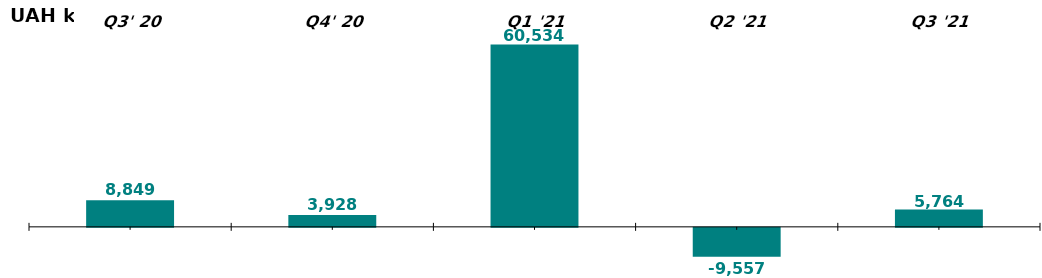
| Category | Quartely Net Flow of Capital in Q3 2020-21, UAH k |
|---|---|
| Q3' 20 | 8849.263 |
| Q4' 20 | 3928.167 |
| Q1 '21 | 60533.895 |
| Q2 '21 | -9557.489 |
| Q3 '21 | 5764.251 |